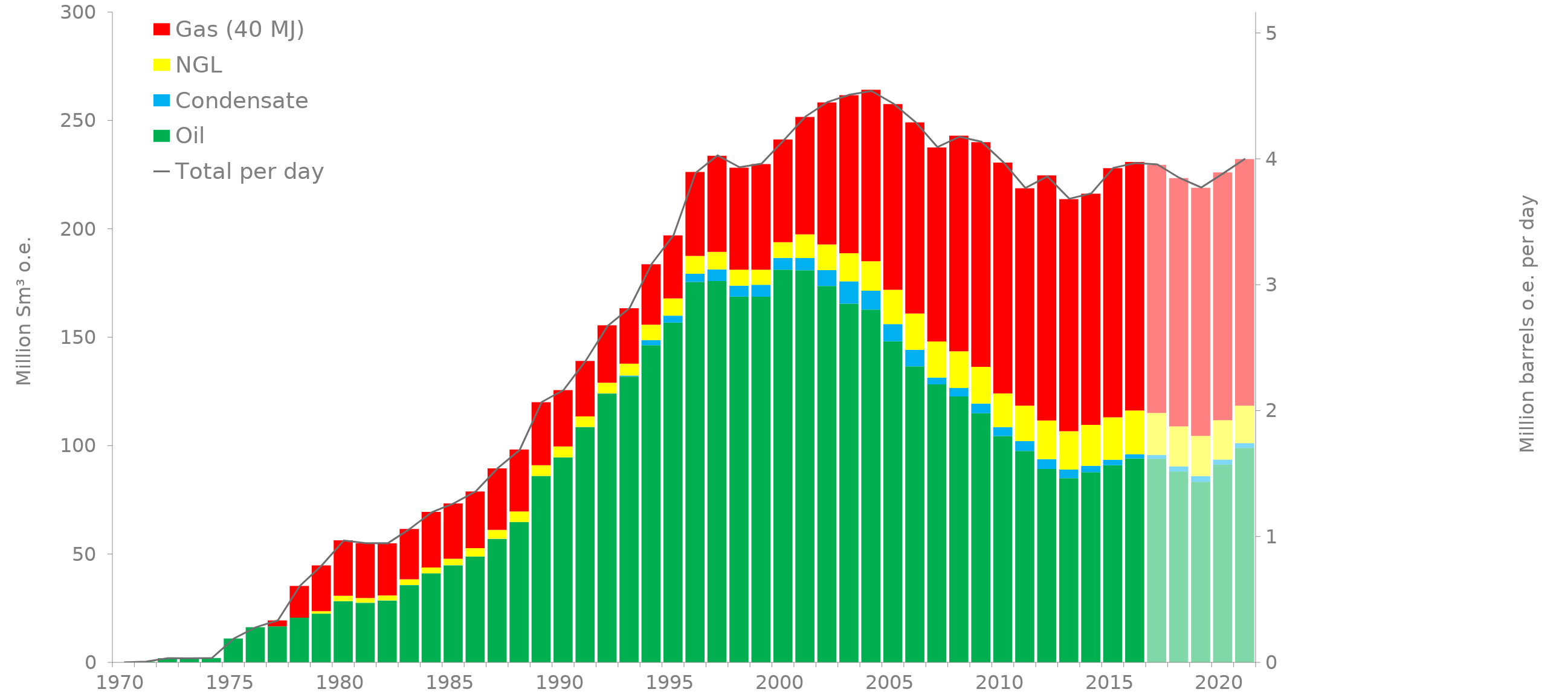
| Category | Oil | Condensate | NGL | Gas (40 MJ) |
|---|---|---|---|---|
| 1970.0 | 0 | 0 | 0 | 0 |
| 1971.0 | 0.36 | 0 | 0 | 0 |
| 1972.0 | 1.93 | 0 | 0 | 0 |
| 1973.0 | 1.87 | 0 | 0 | 0 |
| 1974.0 | 2.01 | 0 | 0 | 0 |
| 1975.0 | 11 | 0 | 0 | 0 |
| 1976.0 | 16.23 | 0 | 0 | 0 |
| 1977.0 | 16.64 | 0 | 0 | 2.72 |
| 1978.0 | 20.64 | 0.02 | 0 | 14.62 |
| 1979.0 | 22.48 | 0.04 | 1.13 | 21.11 |
| 1980.0 | 28.22 | 0.05 | 2.44 | 25.64 |
| 1981.0 | 27.48 | 0.05 | 2.17 | 25.28 |
| 1982.0 | 28.53 | 0.04 | 2.29 | 24.06 |
| 1983.0 | 35.65 | 0.04 | 2.68 | 23.17 |
| 1984.0 | 41.09 | 0.06 | 2.64 | 25.63 |
| 1985.0 | 44.76 | 0.08 | 2.97 | 25.51 |
| 1986.0 | 48.77 | 0.06 | 3.85 | 26.15 |
| 1987.0 | 56.96 | 0.05 | 4.12 | 28.4 |
| 1988.0 | 64.72 | 0.05 | 4.85 | 28.58 |
| 1989.0 | 85.98 | 0.05 | 4.9 | 29.08 |
| 1990.0 | 94.54 | 0.05 | 5.01 | 25.99 |
| 1991.0 | 108.51 | 0.06 | 4.9 | 25.56 |
| 1992.0 | 124 | 0.05 | 4.96 | 26.5 |
| 1993.0 | 131.84 | 0.47 | 5.52 | 25.56 |
| 1994.0 | 146.28 | 2.4 | 7.12 | 27.88 |
| 1995.0 | 156.78 | 3.18 | 7.94 | 29.07 |
| 1996.0 | 175.5 | 3.78 | 8.23 | 38.75 |
| 1997.0 | 175.91 | 5.38 | 8.07 | 44.36 |
| 1998.0 | 168.74 | 5.05 | 7.39 | 47.06 |
| 1999.0 | 168.69 | 5.51 | 6.99 | 48.7 |
| 2000.0 | 181.18 | 5.41 | 7.23 | 47.43 |
| 2001.0 | 180.88 | 5.67 | 10.92 | 54.15 |
| 2002.0 | 173.65 | 7.32 | 11.8 | 65.53 |
| 2003.0 | 165.48 | 10.34 | 12.93 | 72.93 |
| 2004.0 | 162.78 | 8.67 | 13.6 | 79.1 |
| 2005.0 | 148.14 | 7.95 | 15.81 | 85.67 |
| 2006.0 | 136.58 | 7.63 | 16.7 | 88.23 |
| 2007.0 | 128.28 | 3.13 | 16.63 | 89.51 |
| 2008.0 | 122.66 | 3.92 | 16.94 | 99.46 |
| 2009.0 | 114.94 | 4.44 | 16.96 | 103.68 |
| 2010.0 | 104.39 | 4.16 | 15.51 | 106.53 |
| 2011.0 | 97.51 | 4.58 | 16.31 | 100.3 |
| 2012.0 | 89.2 | 4.57 | 17.8 | 113.06 |
| 2013.0 | 84.95 | 3.99 | 17.72 | 107.05 |
| 2014.0 | 87.74 | 2.91 | 18.95 | 106.6 |
| 2015.0 | 90.97 | 2.47 | 19.61 | 114.92 |
| 2016.0 | 94.05 | 2.014 | 20.16 | 114.62 |
| 2017.0 | 93.88 | 1.833 | 19.37 | 114.47 |
| 2018.0 | 88.05 | 2.375 | 18.42 | 114.54 |
| 2019.0 | 83.3 | 2.611 | 18.56 | 114.46 |
| 2020.0 | 91.27 | 2.3 | 18.13 | 114.34 |
| 2021.0 | 98.9 | 2.217 | 17.32 | 113.76 |